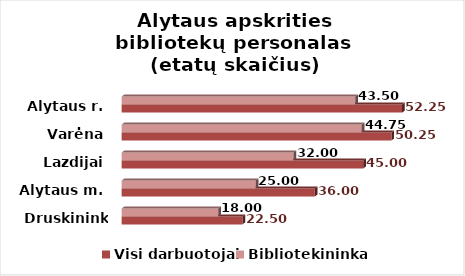
| Category | Visi darbuotojai | Bibliotekininkai |
|---|---|---|
| Druskininkai | 22.5 | 18 |
| Alytaus m. | 36 | 25 |
| Lazdijai | 45 | 32 |
| Varėna | 50.25 | 44.75 |
| Alytaus r. | 52.25 | 43.5 |